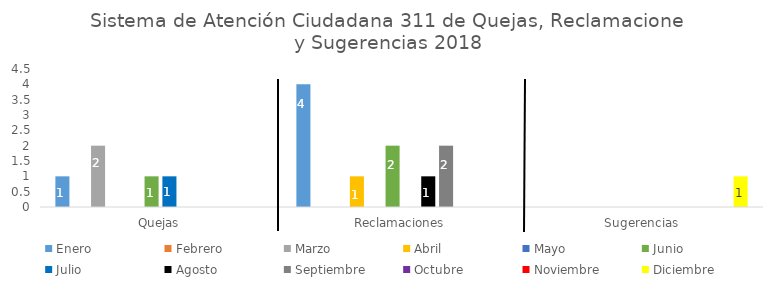
| Category | Enero | Febrero | Marzo | Abril | Mayo | Junio | Julio | Agosto | Septiembre | Octubre | Noviembre | Diciembre |
|---|---|---|---|---|---|---|---|---|---|---|---|---|
| Quejas | 1 | 0 | 2 | 0 | 0 | 1 | 1 | 0 | 0 | 0 | 0 | 0 |
| Reclamaciones | 4 | 0 | 0 | 1 | 0 | 2 | 0 | 1 | 2 | 0 | 0 | 0 |
| Sugerencias | 0 | 0 | 0 | 0 | 0 | 0 | 0 | 0 | 0 | 0 | 0 | 1 |